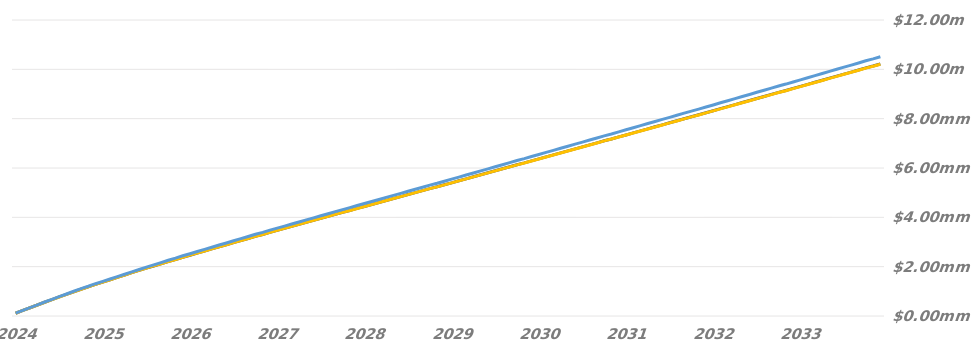
| Category | Cumulative Interest |
|---|---|
| 2024-04-15 | 113185.625 |
| 2024-05-15 | 229619.042 |
| 2024-06-15 | 341948.625 |
| 2024-07-15 | 454890.882 |
| 2024-08-15 | 567816.562 |
| 2024-09-15 | 676890.521 |
| 2024-10-15 | 786707.375 |
| 2024-11-15 | 892966.75 |
| 2024-12-15 | 1002283.729 |
| 2025-01-15 | 1108596.722 |
| 2025-02-15 | 1204595.111 |
| 2025-03-15 | 1309387.382 |
| 2025-04-15 | 1403855.299 |
| 2025-05-15 | 1501472.146 |
| 2025-06-15 | 1595928.188 |
| 2025-07-15 | 1693545.035 |
| 2025-08-15 | 1791155.854 |
| 2025-09-15 | 1885515.646 |
| 2025-10-15 | 1980138.41 |
| 2025-11-15 | 2071703.201 |
| 2025-12-15 | 2166343.188 |
| 2026-01-15 | 2260965.951 |
| 2026-02-15 | 2346415.924 |
| 2026-03-15 | 2440280.264 |
| 2026-04-15 | 2525705.264 |
| 2026-05-15 | 2613992.833 |
| 2026-06-15 | 2699413.042 |
| 2026-07-15 | 2787685.542 |
| 2026-08-15 | 2875968.16 |
| 2026-09-15 | 2961398.16 |
| 2026-10-15 | 3049670.66 |
| 2026-11-15 | 3135090.868 |
| 2026-12-15 | 3223373.486 |
| 2027-01-15 | 3311645.986 |
| 2027-02-15 | 3391362.375 |
| 2027-03-15 | 3479303.563 |
| 2027-04-15 | 3561090.438 |
| 2027-05-15 | 3645617.319 |
| 2027-06-15 | 3727412.944 |
| 2027-07-15 | 3811930.569 |
| 2027-08-15 | 3896457.451 |
| 2027-09-15 | 3978248.701 |
| 2027-10-15 | 4062766.326 |
| 2027-11-15 | 4144553.201 |
| 2027-12-15 | 4229075.347 |
| 2028-01-15 | 4313602.229 |
| 2028-02-15 | 4392658.444 |
| 2028-03-15 | 4477180.59 |
| 2028-04-15 | 4558370.799 |
| 2028-05-15 | 4642276.389 |
| 2028-06-15 | 4723457.847 |
| 2028-07-15 | 4807358.917 |
| 2028-08-15 | 4891255.465 |
| 2028-09-15 | 4972436.924 |
| 2028-10-15 | 5056337.993 |
| 2028-11-15 | 5137523.826 |
| 2028-12-15 | 5221415.854 |
| 2029-01-15 | 5305316.924 |
| 2029-02-15 | 5381078.118 |
| 2029-03-15 | 5465059.701 |
| 2029-04-15 | 5547136.993 |
| 2029-05-15 | 5631959.451 |
| 2029-06-15 | 5714036.743 |
| 2029-07-15 | 5798863.722 |
| 2029-08-15 | 5883681.444 |
| 2029-09-15 | 5965758.736 |
| 2029-10-15 | 6050585.715 |
| 2029-11-15 | 6132663.007 |
| 2029-12-15 | 6217494.722 |
| 2030-01-15 | 6302321.701 |
| 2030-02-15 | 6378918.812 |
| 2030-03-15 | 6463807.792 |
| 2030-04-15 | 6546139.458 |
| 2030-05-15 | 6631220.035 |
| 2030-06-15 | 6713551.701 |
| 2030-07-15 | 6798641.75 |
| 2030-08-15 | 6883722.326 |
| 2030-09-15 | 6966053.993 |
| 2030-10-15 | 7051139.306 |
| 2030-11-15 | 7133470.972 |
| 2030-12-15 | 7218565.542 |
| 2031-01-15 | 7303650.854 |
| 2031-02-15 | 7380485.188 |
| 2031-03-15 | 7465611.618 |
| 2031-04-15 | 7548185.576 |
| 2031-05-15 | 7633512 |
| 2031-06-15 | 7716077 |
| 2031-07-15 | 7801403.424 |
| 2031-08-15 | 7886725.111 |
| 2031-09-15 | 7969290.111 |
| 2031-10-15 | 8054611.799 |
| 2031-11-15 | 8137176.799 |
| 2031-12-15 | 8222512.694 |
| 2032-01-15 | 8307834.382 |
| 2032-02-15 | 8387642.785 |
| 2032-03-15 | 8473061.347 |
| 2032-04-15 | 8556555.514 |
| 2032-05-15 | 8642847.243 |
| 2032-06-15 | 8726350.576 |
| 2032-07-15 | 8812632.618 |
| 2032-08-15 | 8898924.347 |
| 2032-09-15 | 8982423.097 |
| 2032-10-15 | 9068705.139 |
| 2032-11-15 | 9152199.306 |
| 2032-12-15 | 9238486.083 |
| 2033-01-15 | 9324777.812 |
| 2033-02-15 | 9402696.951 |
| 2033-03-15 | 9488988.681 |
| 2033-04-15 | 9572938.472 |
| 2033-05-15 | 9659696.278 |
| 2033-06-15 | 9743641.486 |
| 2033-07-15 | 9830384.868 |
| 2033-08-15 | 9917137.937 |
| 2033-09-15 | 10001078.354 |
| 2033-10-15 | 10087831.424 |
| 2033-11-15 | 10171781.215 |
| 2033-12-15 | 10258524.597 |
| 2034-01-15 | 10345277.667 |
| 2034-02-15 | 10423613.306 |
| 2034-03-15 | 10510356.687 |